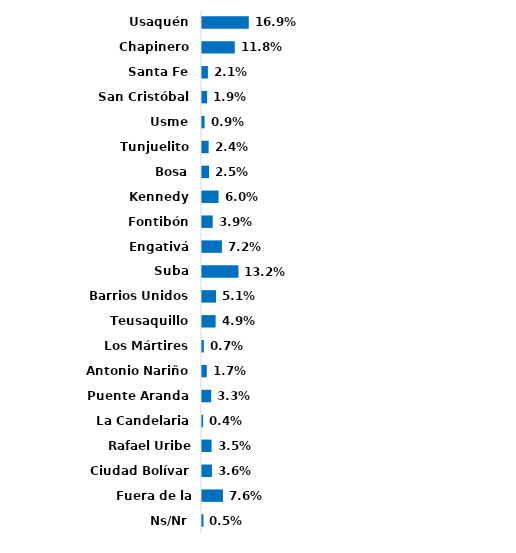
| Category | Series 0 |
|---|---|
| Usaquén | 0.169 |
| Chapinero | 0.118 |
| Santa Fe | 0.021 |
| San Cristóbal | 0.019 |
| Usme | 0.009 |
| Tunjuelito | 0.024 |
| Bosa | 0.025 |
| Kennedy | 0.06 |
| Fontibón | 0.039 |
| Engativá | 0.072 |
| Suba | 0.132 |
| Barrios Unidos | 0.051 |
| Teusaquillo | 0.049 |
| Los Mártires | 0.007 |
| Antonio Nariño | 0.017 |
| Puente Aranda | 0.033 |
| La Candelaria | 0.004 |
| Rafael Uribe Uribe | 0.035 |
| Ciudad Bolívar | 0.036 |
| Fuera de la ciudad | 0.076 |
| Ns/Nr | 0.005 |